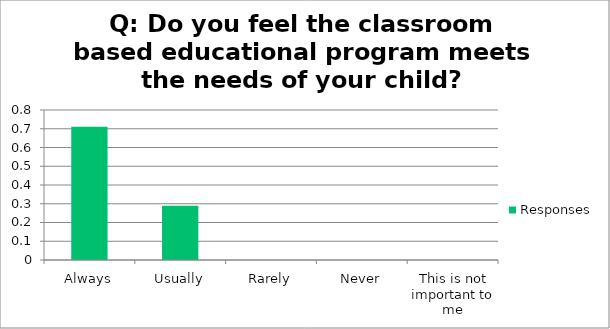
| Category | Responses |
|---|---|
| Always | 0.71 |
| Usually | 0.29 |
| Rarely | 0 |
| Never | 0 |
| This is not important to me | 0 |